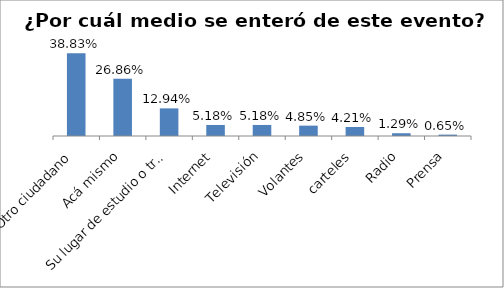
| Category | Total |
|---|---|
| Otro ciudadano | 0.388 |
| Acá mismo | 0.269 |
| Su lugar de estudio o trabajo | 0.129 |
| Internet | 0.052 |
| Televisión | 0.052 |
| Volantes, carteles | 0.049 |
| Radio | 0.042 |
| Prensa | 0.013 |
| Ns/Nr | 0.006 |